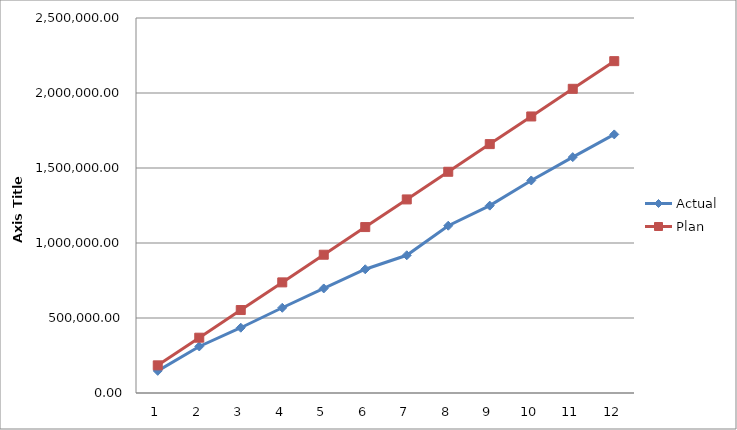
| Category | Actual | Plan |
|---|---|---|
| 0 | 147695.8 | 184358.333 |
| 1 | 310264.15 | 368716.667 |
| 2 | 435146.94 | 553075 |
| 3 | 568265.37 | 737433.333 |
| 4 | 696903.7 | 921791.667 |
| 5 | 824971.02 | 1106150 |
| 6 | 918169.7 | 1290508.333 |
| 7 | 1115161.86 | 1474866.667 |
| 8 | 1249036.8 | 1659225 |
| 9 | 1416821.69 | 1843583.333 |
| 10 | 1572427.6 | 2027941.667 |
| 11 | 1723902.91 | 2212300 |